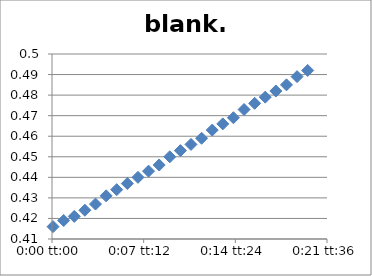
| Category | blank.3 |
|---|---|
| 5.78703703703704e-05 | 0.416 |
| 0.000636574074074074 | 0.419 |
| 0.00121527777777778 | 0.421 |
| 0.00179398148148148 | 0.424 |
| 0.00237268518518518 | 0.427 |
| 0.00295138888888889 | 0.431 |
| 0.00353009259259259 | 0.434 |
| 0.0041087962962963 | 0.437 |
| 0.0046875 | 0.44 |
| 0.0052662037037037 | 0.443 |
| 0.00584490740740741 | 0.446 |
| 0.00642361111111111 | 0.45 |
| 0.00700231481481481 | 0.453 |
| 0.00758101851851852 | 0.456 |
| 0.00815972222222222 | 0.459 |
| 0.00873842592592592 | 0.463 |
| 0.00931712962962963 | 0.466 |
| 0.00989583333333333 | 0.469 |
| 0.010474537037037 | 0.473 |
| 0.0110532407407407 | 0.476 |
| 0.0116319444444444 | 0.479 |
| 0.0122106481481481 | 0.482 |
| 0.0127893518518518 | 0.485 |
| 0.0133680555555556 | 0.489 |
| 0.0139467592592593 | 0.492 |